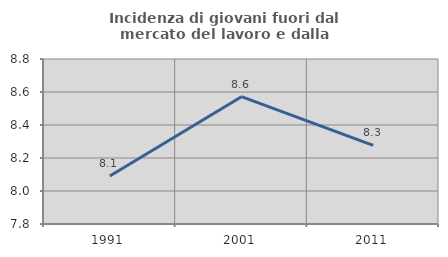
| Category | Incidenza di giovani fuori dal mercato del lavoro e dalla formazione  |
|---|---|
| 1991.0 | 8.091 |
| 2001.0 | 8.571 |
| 2011.0 | 8.277 |